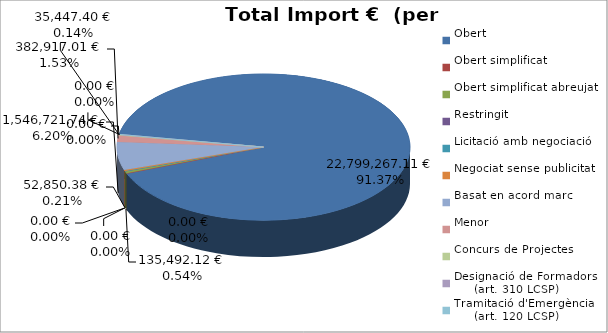
| Category | Total preu
(amb IVA) |
|---|---|
| Obert | 22799267.11 |
| Obert simplificat | 0 |
| Obert simplificat abreujat | 135492.12 |
| Restringit | 0 |
| Licitació amb negociació | 0 |
| Negociat sense publicitat | 52850.38 |
| Basat en acord marc | 1546721.74 |
| Menor | 382917.01 |
| Concurs de Projectes | 0 |
| Designació de Formadors
     (art. 310 LCSP) | 35447.4 |
| Tramitació d'Emergència
     (art. 120 LCSP) | 0 |